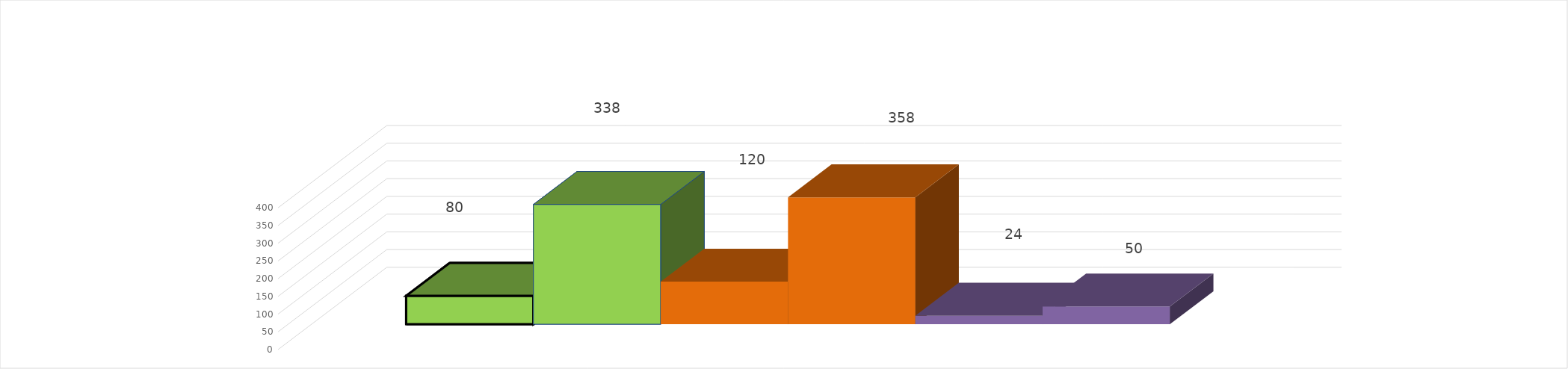
| Category | 1 квартал 2020 год | 1 квартал 2021 год |
|---|---|---|
| 0 | 24 | 50 |